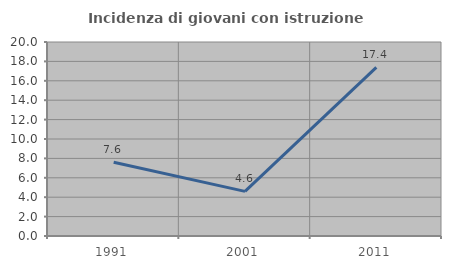
| Category | Incidenza di giovani con istruzione universitaria |
|---|---|
| 1991.0 | 7.609 |
| 2001.0 | 4.598 |
| 2011.0 | 17.391 |